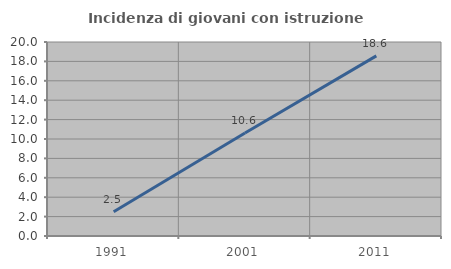
| Category | Incidenza di giovani con istruzione universitaria |
|---|---|
| 1991.0 | 2.5 |
| 2001.0 | 10.619 |
| 2011.0 | 18.571 |